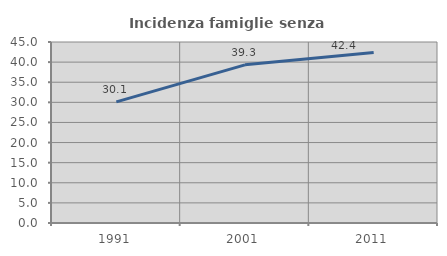
| Category | Incidenza famiglie senza nuclei |
|---|---|
| 1991.0 | 30.1 |
| 2001.0 | 39.318 |
| 2011.0 | 42.411 |